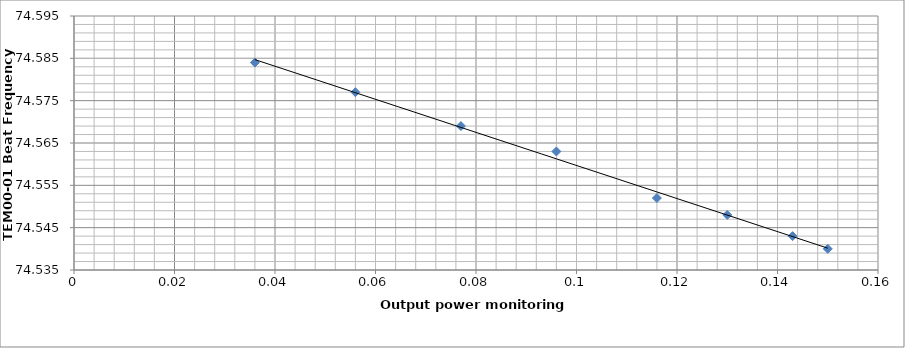
| Category | Series 0 |
|---|---|
| 0.15 | 74.54 |
| 0.143 | 74.543 |
| 0.13 | 74.548 |
| 0.116 | 74.552 |
| 0.096 | 74.563 |
| 0.077 | 74.569 |
| 0.056 | 74.577 |
| 0.036 | 74.584 |